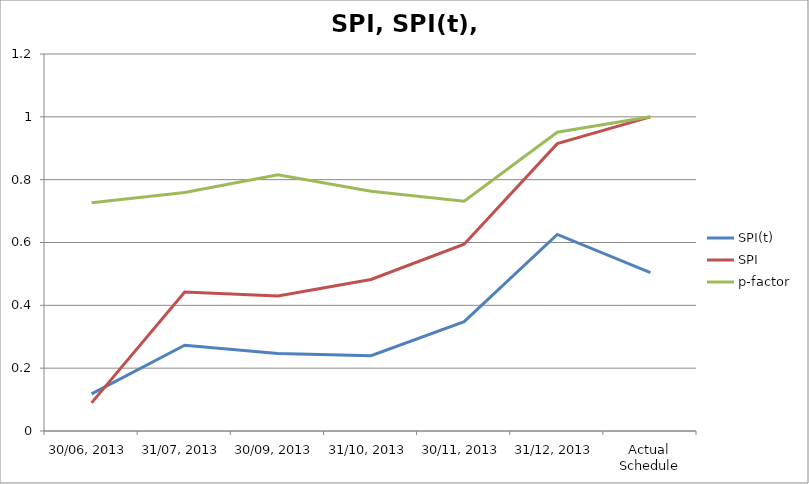
| Category | SPI(t) | SPI | p-factor |
|---|---|---|---|
| 30/06, 2013 | 0.118 | 0.089 | 0.726 |
| 31/07, 2013 | 0.273 | 0.442 | 0.759 |
| 30/09, 2013 | 0.247 | 0.43 | 0.815 |
| 31/10, 2013 | 0.24 | 0.482 | 0.763 |
| 30/11, 2013 | 0.348 | 0.595 | 0.731 |
| 31/12, 2013 | 0.626 | 0.915 | 0.951 |
| Actual Schedule | 0.504 | 1 | 1 |